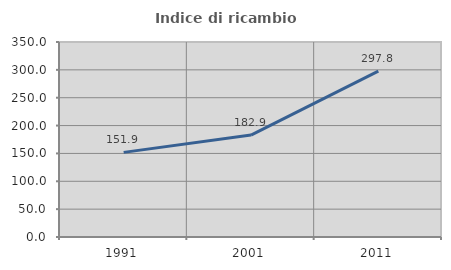
| Category | Indice di ricambio occupazionale  |
|---|---|
| 1991.0 | 151.875 |
| 2001.0 | 182.927 |
| 2011.0 | 297.778 |